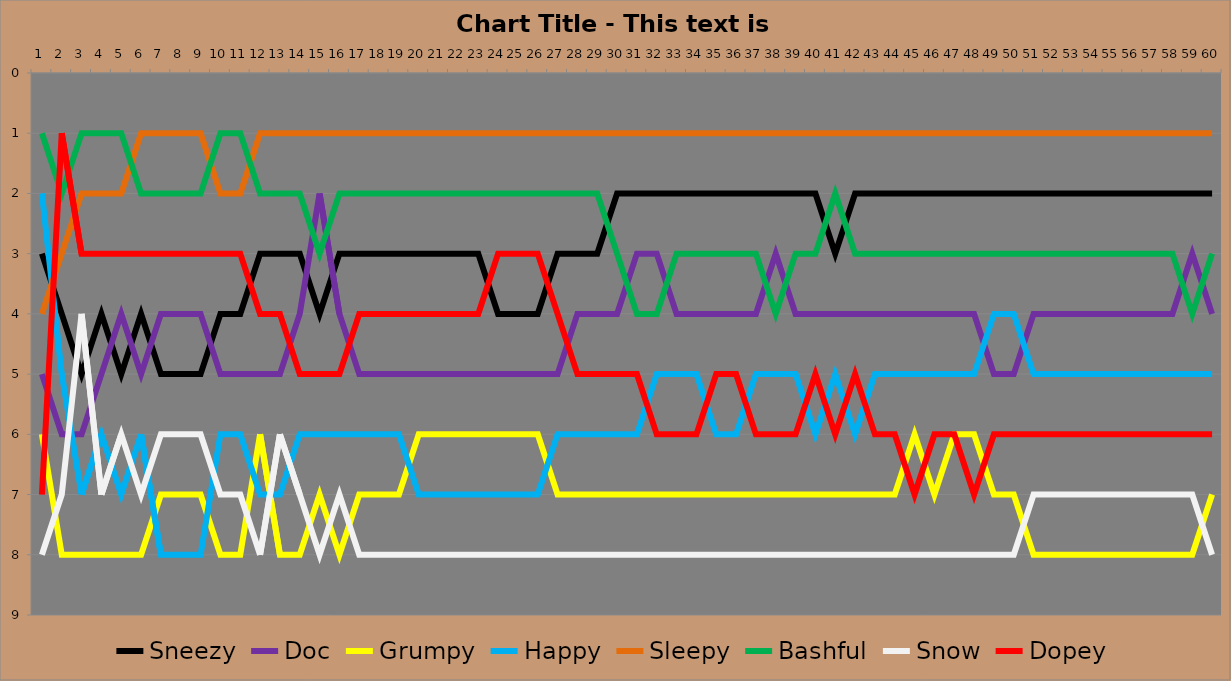
| Category | Sneezy | Doc | Grumpy | Happy | Sleepy | Bashful | Snow | Dopey |
|---|---|---|---|---|---|---|---|---|
| 0 | 3 | 5 | 6 | 2 | 4 | 1 | 8 | 7 |
| 1 | 4 | 6 | 8 | 5 | 3 | 2 | 7 | 1 |
| 2 | 5 | 6 | 8 | 7 | 2 | 1 | 4 | 3 |
| 3 | 4 | 5 | 8 | 6 | 2 | 1 | 7 | 3 |
| 4 | 5 | 4 | 8 | 7 | 2 | 1 | 6 | 3 |
| 5 | 4 | 5 | 8 | 6 | 1 | 2 | 7 | 3 |
| 6 | 5 | 4 | 7 | 8 | 1 | 2 | 6 | 3 |
| 7 | 5 | 4 | 7 | 8 | 1 | 2 | 6 | 3 |
| 8 | 5 | 4 | 7 | 8 | 1 | 2 | 6 | 3 |
| 9 | 4 | 5 | 8 | 6 | 2 | 1 | 7 | 3 |
| 10 | 4 | 5 | 8 | 6 | 2 | 1 | 7 | 3 |
| 11 | 3 | 5 | 6 | 7 | 1 | 2 | 8 | 4 |
| 12 | 3 | 5 | 8 | 7 | 1 | 2 | 6 | 4 |
| 13 | 3 | 4 | 8 | 6 | 1 | 2 | 7 | 5 |
| 14 | 4 | 2 | 7 | 6 | 1 | 3 | 8 | 5 |
| 15 | 3 | 4 | 8 | 6 | 1 | 2 | 7 | 5 |
| 16 | 3 | 5 | 7 | 6 | 1 | 2 | 8 | 4 |
| 17 | 3 | 5 | 7 | 6 | 1 | 2 | 8 | 4 |
| 18 | 3 | 5 | 7 | 6 | 1 | 2 | 8 | 4 |
| 19 | 3 | 5 | 6 | 7 | 1 | 2 | 8 | 4 |
| 20 | 3 | 5 | 6 | 7 | 1 | 2 | 8 | 4 |
| 21 | 3 | 5 | 6 | 7 | 1 | 2 | 8 | 4 |
| 22 | 3 | 5 | 6 | 7 | 1 | 2 | 8 | 4 |
| 23 | 4 | 5 | 6 | 7 | 1 | 2 | 8 | 3 |
| 24 | 4 | 5 | 6 | 7 | 1 | 2 | 8 | 3 |
| 25 | 4 | 5 | 6 | 7 | 1 | 2 | 8 | 3 |
| 26 | 3 | 5 | 7 | 6 | 1 | 2 | 8 | 4 |
| 27 | 3 | 4 | 7 | 6 | 1 | 2 | 8 | 5 |
| 28 | 3 | 4 | 7 | 6 | 1 | 2 | 8 | 5 |
| 29 | 2 | 4 | 7 | 6 | 1 | 3 | 8 | 5 |
| 30 | 2 | 3 | 7 | 6 | 1 | 4 | 8 | 5 |
| 31 | 2 | 3 | 7 | 5 | 1 | 4 | 8 | 6 |
| 32 | 2 | 4 | 7 | 5 | 1 | 3 | 8 | 6 |
| 33 | 2 | 4 | 7 | 5 | 1 | 3 | 8 | 6 |
| 34 | 2 | 4 | 7 | 6 | 1 | 3 | 8 | 5 |
| 35 | 2 | 4 | 7 | 6 | 1 | 3 | 8 | 5 |
| 36 | 2 | 4 | 7 | 5 | 1 | 3 | 8 | 6 |
| 37 | 2 | 3 | 7 | 5 | 1 | 4 | 8 | 6 |
| 38 | 2 | 4 | 7 | 5 | 1 | 3 | 8 | 6 |
| 39 | 2 | 4 | 7 | 6 | 1 | 3 | 8 | 5 |
| 40 | 3 | 4 | 7 | 5 | 1 | 2 | 8 | 6 |
| 41 | 2 | 4 | 7 | 6 | 1 | 3 | 8 | 5 |
| 42 | 2 | 4 | 7 | 5 | 1 | 3 | 8 | 6 |
| 43 | 2 | 4 | 7 | 5 | 1 | 3 | 8 | 6 |
| 44 | 2 | 4 | 6 | 5 | 1 | 3 | 8 | 7 |
| 45 | 2 | 4 | 7 | 5 | 1 | 3 | 8 | 6 |
| 46 | 2 | 4 | 6 | 5 | 1 | 3 | 8 | 6 |
| 47 | 2 | 4 | 6 | 5 | 1 | 3 | 8 | 7 |
| 48 | 2 | 5 | 7 | 4 | 1 | 3 | 8 | 6 |
| 49 | 2 | 5 | 7 | 4 | 1 | 3 | 8 | 6 |
| 50 | 2 | 4 | 8 | 5 | 1 | 3 | 7 | 6 |
| 51 | 2 | 4 | 8 | 5 | 1 | 3 | 7 | 6 |
| 52 | 2 | 4 | 8 | 5 | 1 | 3 | 7 | 6 |
| 53 | 2 | 4 | 8 | 5 | 1 | 3 | 7 | 6 |
| 54 | 2 | 4 | 8 | 5 | 1 | 3 | 7 | 6 |
| 55 | 2 | 4 | 8 | 5 | 1 | 3 | 7 | 6 |
| 56 | 2 | 4 | 8 | 5 | 1 | 3 | 7 | 6 |
| 57 | 2 | 4 | 8 | 5 | 1 | 3 | 7 | 6 |
| 58 | 2 | 3 | 8 | 5 | 1 | 4 | 7 | 6 |
| 59 | 2 | 4 | 7 | 5 | 1 | 3 | 8 | 6 |